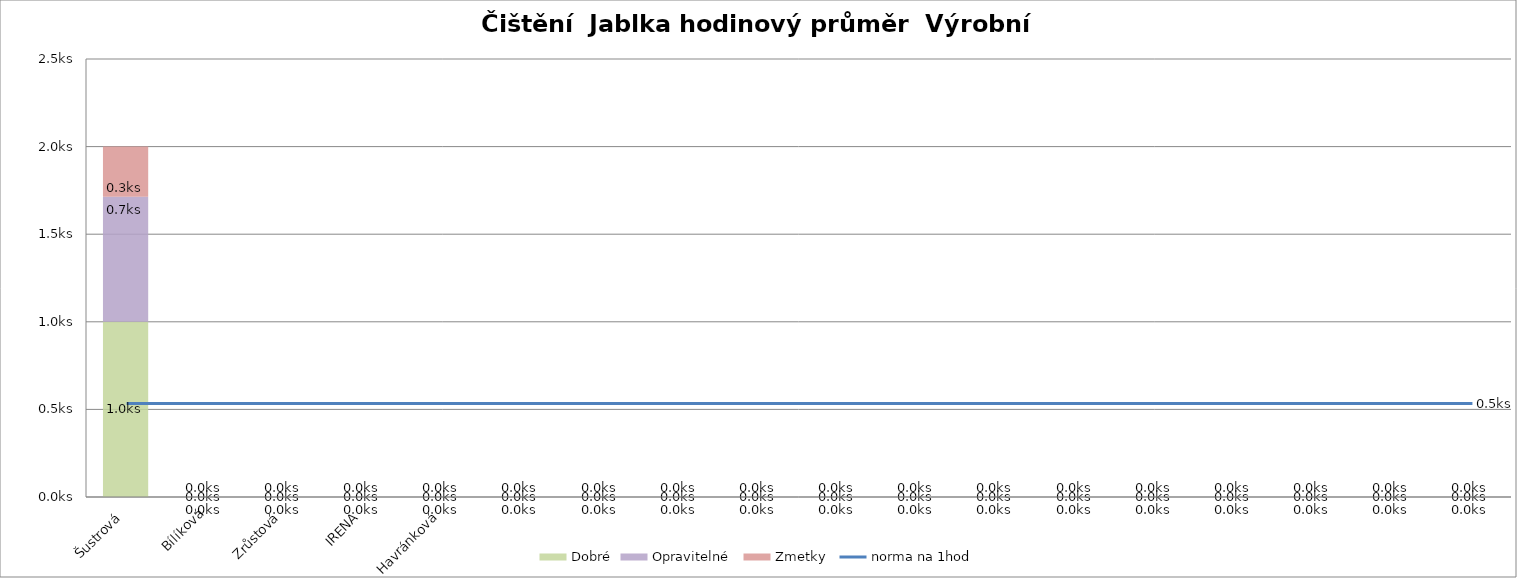
| Category | Dobré | Opravitelné  | Zmetky  |
|---|---|---|---|
| Šustrová | 1 | 0.714 | 0.286 |
| Bílíková | 0 | 0 | 0 |
| Zrůstová | 0 | 0 | 0 |
| IRENA | 0 | 0 | 0 |
| Havránková | 0 | 0 | 0 |